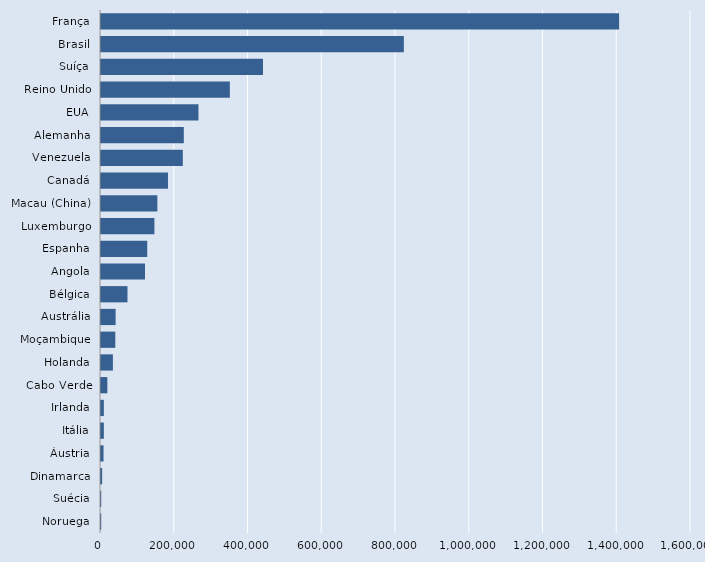
| Category | Series 0 |
|---|---|
| Noruega | 609 |
| Suécia | 609 |
| Dinamarca | 3092 |
| Áustria | 6854 |
| Itália | 7747 |
| Irlanda | 7755 |
| Cabo Verde | 17235 |
| Holanda | 32280 |
| Moçambique | 38805 |
| Austrália | 39674 |
| Bélgica | 71829 |
| Angola | 119326 |
| Espanha | 125382 |
| Luxemburgo | 144836 |
| Macau (China) | 152836 |
| Canadá | 181645 |
| Venezuela | 221836 |
| Alemanha | 224573 |
| EUA | 264279 |
| Reino Unido | 349427 |
| Suíça | 439342 |
| Brasil | 821276 |
| França | 1405053 |